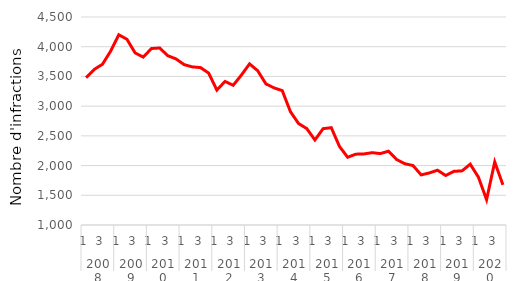
| Category | Série CVS-CJO |
|---|---|
| 0 | 3478.458 |
| 1 | 3618.762 |
| 2 | 3704.077 |
| 3 | 3923.894 |
| 4 | 4200.835 |
| 5 | 4125.229 |
| 6 | 3895.424 |
| 7 | 3825.714 |
| 8 | 3969.872 |
| 9 | 3978.569 |
| 10 | 3848.713 |
| 11 | 3794.602 |
| 12 | 3698.664 |
| 13 | 3660.392 |
| 14 | 3649.036 |
| 15 | 3555.79 |
| 16 | 3270.564 |
| 17 | 3415.964 |
| 18 | 3350.989 |
| 19 | 3522.95 |
| 20 | 3711.132 |
| 21 | 3595.001 |
| 22 | 3375.385 |
| 23 | 3306.905 |
| 24 | 3261.776 |
| 25 | 2907.848 |
| 26 | 2706.844 |
| 27 | 2622.278 |
| 28 | 2430.152 |
| 29 | 2621.039 |
| 30 | 2637.617 |
| 31 | 2322.696 |
| 32 | 2139.601 |
| 33 | 2191.847 |
| 34 | 2196.104 |
| 35 | 2217.073 |
| 36 | 2201.861 |
| 37 | 2242.046 |
| 38 | 2101.183 |
| 39 | 2031.086 |
| 40 | 2000.47 |
| 41 | 1842.859 |
| 42 | 1876.294 |
| 43 | 1922.128 |
| 44 | 1832.423 |
| 45 | 1902.628 |
| 46 | 1911.097 |
| 47 | 2023.337 |
| 48 | 1805.826 |
| 49 | 1426.596 |
| 50 | 2060.842 |
| 51 | 1675.686 |